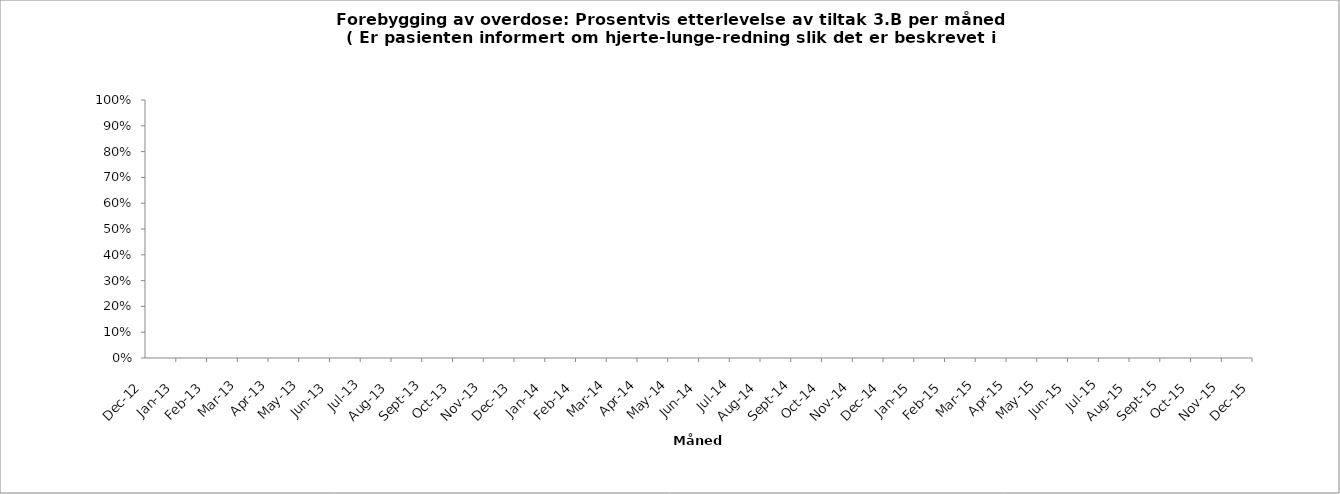
| Category | p_P4 | m_P4 |
|---|---|---|
| 2012-12-01 |  | 0 |
| 2013-01-01 |  | 0 |
| 2013-02-01 |  | 0 |
| 2013-03-01 |  | 0 |
| 2013-04-01 |  | 0 |
| 2013-05-01 |  | 0 |
| 2013-06-01 |  | 0 |
| 2013-07-01 |  | 0 |
| 2013-08-01 |  | 0 |
| 2013-09-01 |  | 0 |
| 2013-10-01 |  | 0 |
| 2013-11-01 |  | 0 |
| 2013-12-01 |  | 0 |
| 2014-01-01 |  | 0 |
| 2014-02-01 |  | 0 |
| 2014-03-01 |  | 0 |
| 2014-04-01 |  | 0 |
| 2014-05-01 |  | 0 |
| 2014-06-01 |  | 0 |
| 2014-07-01 |  | 0 |
| 2014-08-01 |  | 0 |
| 2014-09-01 |  | 0 |
| 2014-10-01 |  | 0 |
| 2014-11-01 |  | 0 |
| 2014-12-01 |  | 0 |
| 2015-01-01 |  | 0 |
| 2015-02-01 |  | 0 |
| 2015-03-01 |  | 0 |
| 2015-04-01 |  | 0 |
| 2015-05-01 |  | 0 |
| 2015-06-01 |  | 0 |
| 2015-07-01 |  | 0 |
| 2015-08-01 |  | 0 |
| 2015-09-01 |  | 0 |
| 2015-10-01 |  | 0 |
| 2015-11-01 |  | 0 |
| 2015-12-01 |  | 0 |